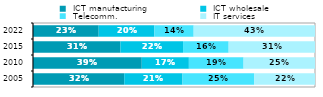
| Category |  ICT manufacturing |  ICT wholesale |  Telecomm. |  IT services |
|---|---|---|---|---|
| 2005.0 | 0.324 | 0.207 | 0.254 | 0.216 |
| 2010.0 | 0.386 | 0.167 | 0.194 | 0.253 |
| 2015.0 | 0.31 | 0.222 | 0.162 | 0.306 |
| 2022.0 | 0.233 | 0.198 | 0.139 | 0.43 |